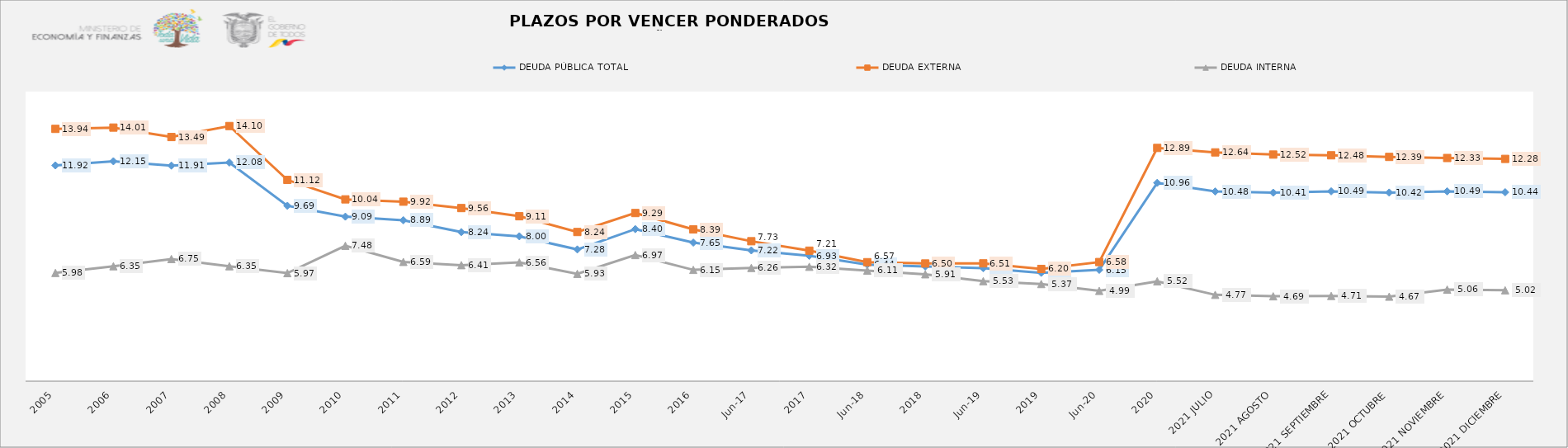
| Category | DEUDA PÚBLICA TOTAL | DEUDA EXTERNA  | DEUDA INTERNA |
|---|---|---|---|
| 2005 | 11.92 | 13.939 | 5.98 |
| 2006 | 12.15 | 14.01 | 6.35 |
| 2007 | 11.91 | 13.489 | 6.75 |
| 2008 | 12.08 | 14.097 | 6.35 |
| 2009 | 9.69 | 11.12 | 5.97 |
| 2010 | 9.09 | 10.045 | 7.48 |
| 2011 | 8.889 | 9.918 | 6.59 |
| 2012 | 8.237 | 9.564 | 6.41 |
| 2013 | 8.003 | 9.112 | 6.56 |
| 2014 | 7.278 | 8.241 | 5.93 |
| 2015 | 8.401 | 9.29 | 6.969 |
| 2016 | 7.655 | 8.385 | 6.149 |
| jun-17 | 7.224 | 7.733 | 6.257 |
| 2017 | 6.927 | 7.21 | 6.32 |
| jun-18 | 6.439 | 6.574 | 6.111 |
| 2018 | 6.337 | 6.503 | 5.906 |
| jun-19 | 6.246 | 6.509 | 5.526 |
| 2019 | 5.988 | 6.201 | 5.368 |
| jun-20 | 6.152 | 6.581 | 4.989 |
| 2020 | 10.957 | 12.887 | 5.519 |
| 2021 JULIO | 10.48 | 12.64 | 4.77 |
| 2021 AGOSTO | 10.414 | 12.52 | 4.69 |
| 2021 SEPTIEMBRE | 10.49 | 12.48 | 4.71 |
| 2021 OCTUBRE | 10.42 | 12.39 | 4.67 |
| 2021 NOVIEMBRE | 10.49 | 12.33 | 5.06 |
| 2021 DICIEMBRE | 10.44 | 12.28 | 5.02 |